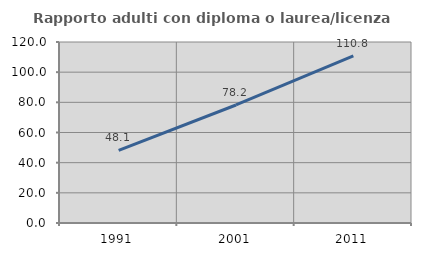
| Category | Rapporto adulti con diploma o laurea/licenza media  |
|---|---|
| 1991.0 | 48.106 |
| 2001.0 | 78.238 |
| 2011.0 | 110.847 |